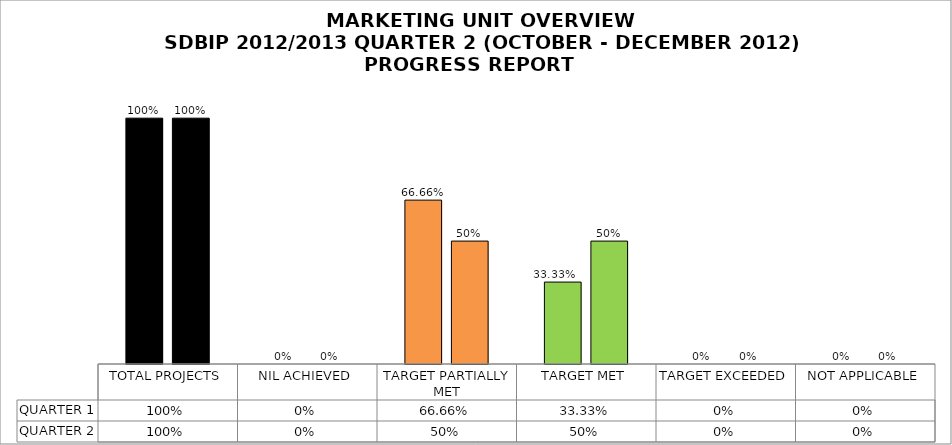
| Category | QUARTER 1 | QUARTER 2 |
|---|---|---|
| TOTAL PROJECTS | 1 | 1 |
| NIL ACHIEVED | 0 | 0 |
| TARGET PARTIALLY MET | 0.667 | 0.5 |
| TARGET MET | 0.333 | 0.5 |
| TARGET EXCEEDED | 0 | 0 |
| NOT APPLICABLE | 0 | 0 |